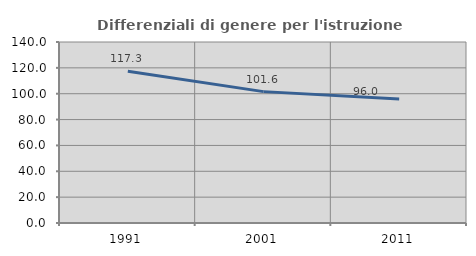
| Category | Differenziali di genere per l'istruzione superiore |
|---|---|
| 1991.0 | 117.338 |
| 2001.0 | 101.617 |
| 2011.0 | 95.971 |